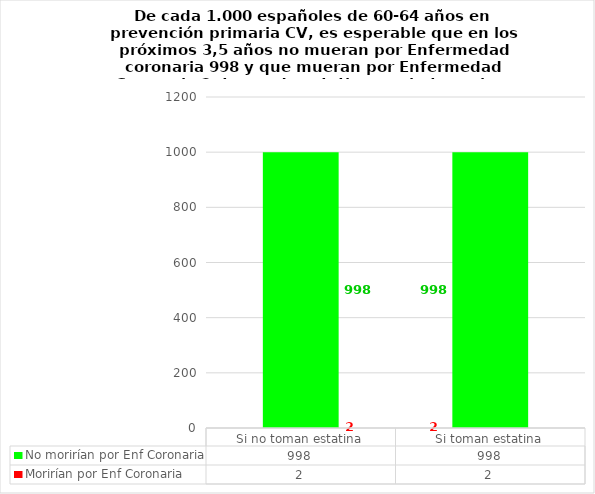
| Category | Morirían por Enf Coronaria | No morirían por Enf Coronaria |
|---|---|---|
| Si no toman estatina | 2 | 998 |
| Si toman estatina | 2 | 998 |